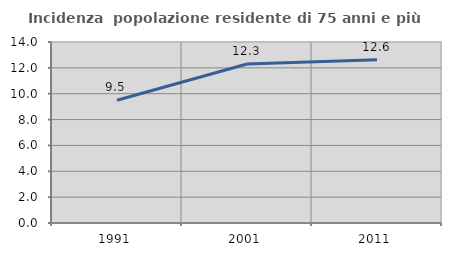
| Category | Incidenza  popolazione residente di 75 anni e più |
|---|---|
| 1991.0 | 9.491 |
| 2001.0 | 12.295 |
| 2011.0 | 12.632 |